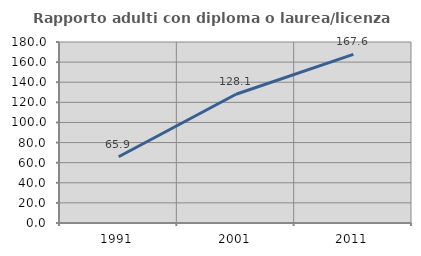
| Category | Rapporto adulti con diploma o laurea/licenza media  |
|---|---|
| 1991.0 | 65.918 |
| 2001.0 | 128.06 |
| 2011.0 | 167.618 |